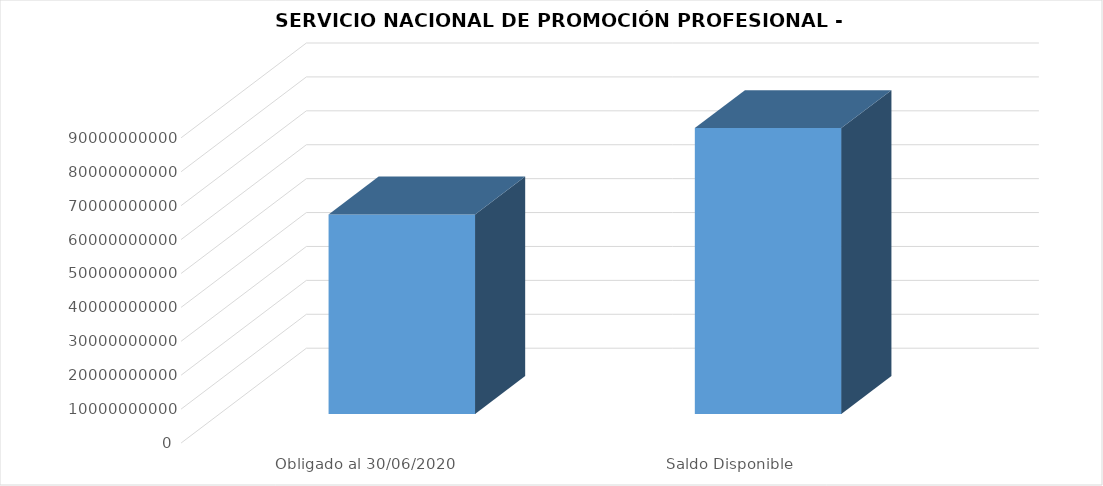
| Category | SERVICIO NACIONAL DE PROMOCIÓN PROFESIONAL |
|---|---|
| Obligado al 30/06/2020 | 58806925310 |
| Saldo Disponible | 84289253083 |